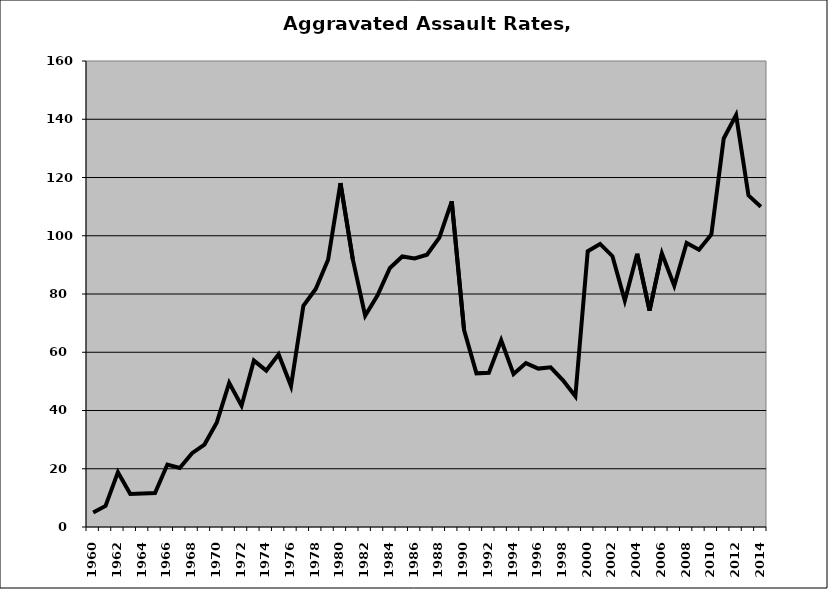
| Category | Aggravated Assault |
|---|---|
| 1960.0 | 4.943 |
| 1961.0 | 7.246 |
| 1962.0 | 18.829 |
| 1963.0 | 11.324 |
| 1964.0 | 11.468 |
| 1965.0 | 11.659 |
| 1966.0 | 21.439 |
| 1967.0 | 20.262 |
| 1968.0 | 25.356 |
| 1969.0 | 28.312 |
| 1970.0 | 35.923 |
| 1971.0 | 49.475 |
| 1972.0 | 41.634 |
| 1973.0 | 57.143 |
| 1974.0 | 53.713 |
| 1975.0 | 59.291 |
| 1976.0 | 48.418 |
| 1977.0 | 75.972 |
| 1978.0 | 81.745 |
| 1979.0 | 91.77 |
| 1980.0 | 118.048 |
| 1981.0 | 91.872 |
| 1982.0 | 72.555 |
| 1983.0 | 79.562 |
| 1984.0 | 88.946 |
| 1985.0 | 92.886 |
| 1986.0 | 92.21 |
| 1987.0 | 93.472 |
| 1988.0 | 99.362 |
| 1989.0 | 111.834 |
| 1990.0 | 67.613 |
| 1991.0 | 52.76 |
| 1992.0 | 52.925 |
| 1993.0 | 64.089 |
| 1994.0 | 52.507 |
| 1995.0 | 56.272 |
| 1996.0 | 54.389 |
| 1997.0 | 54.817 |
| 1998.0 | 50.38 |
| 1999.0 | 44.874 |
| 2000.0 | 94.677 |
| 2001.0 | 97.192 |
| 2002.0 | 92.985 |
| 2003.0 | 77.752 |
| 2004.0 | 93.829 |
| 2005.0 | 74.303 |
| 2006.0 | 93.924 |
| 2007.0 | 82.838 |
| 2008.0 | 97.513 |
| 2009.0 | 95.2 |
| 2010.0 | 100.42 |
| 2011.0 | 133.403 |
| 2012.0 | 141.418 |
| 2013.0 | 113.865 |
| 2014.0 | 109.963 |